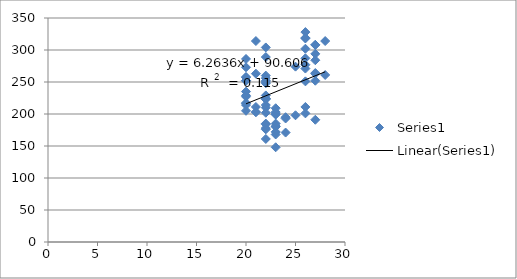
| Category | Series 0 |
|---|---|
| 20.0 | 258 |
| 20.0 | 214 |
| 20.0 | 273 |
| 20.0 | 286 |
| 20.0 | 257 |
| 21.0 | 211 |
| 22.0 | 178 |
| 22.0 | 176 |
| 22.0 | 184 |
| 23.0 | 172 |
| 23.0 | 185 |
| 25.0 | 274 |
| 26.0 | 211 |
| 26.0 | 287 |
| 27.0 | 263 |
| 20.0 | 217 |
| 20.0 | 205 |
| 20.0 | 252 |
| 20.0 | 217 |
| 20.0 | 235 |
| 20.0 | 227 |
| 20.0 | 229 |
| 20.0 | 252 |
| 21.0 | 203 |
| 21.0 | 203 |
| 21.0 | 314 |
| 22.0 | 161 |
| 22.0 | 185 |
| 23.0 | 148 |
| 25.0 | 198 |
| 26.0 | 251 |
| 26.0 | 318 |
| 26.0 | 328 |
| 26.0 | 319 |
| 22.0 | 248 |
| 22.0 | 304 |
| 22.0 | 202 |
| 22.0 | 260 |
| 22.0 | 224 |
| 22.0 | 250 |
| 22.0 | 224 |
| 22.0 | 256 |
| 22.0 | 223 |
| 21.0 | 263 |
| 23.0 | 209 |
| 24.0 | 193 |
| 24.0 | 195 |
| 24.0 | 171 |
| 26.0 | 201 |
| 26.0 | 277 |
| 26.0 | 302 |
| 27.0 | 308 |
| 27.0 | 252 |
| 22.0 | 229 |
| 22.0 | 214 |
| 22.0 | 210 |
| 22.0 | 252 |
| 22.0 | 289 |
| 23.0 | 200 |
| 23.0 | 180 |
| 23.0 | 181 |
| 23.0 | 203 |
| 23.0 | 168 |
| 23.0 | 199 |
| 26.0 | 271 |
| 27.0 | 264 |
| 27.0 | 191 |
| 27.0 | 294 |
| 27.0 | 308 |
| 27.0 | 284 |
| 28.0 | 314 |
| 28.0 | 261 |